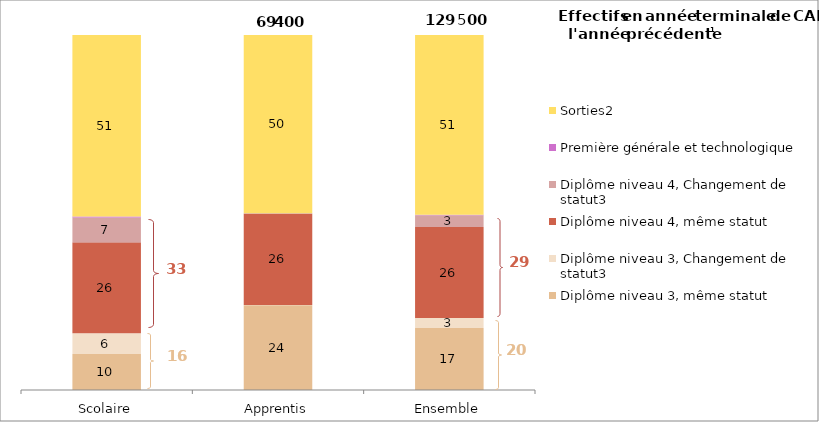
| Category | Diplôme niveau 3, même statut | Diplôme niveau 3, Changement de statut3 | Diplôme niveau 4, même statut | Diplôme niveau 4, Changement de statut3 | Première générale et technologique | Sorties2 |
|---|---|---|---|---|---|---|
| Scolaire | 10.153 | 5.853 | 25.539 | 7.08 | 0.259 | 51.116 |
| Apprentis | 23.837 | 0.097 | 25.705 | 0.143 | 0.016 | 50.191 |
| Ensemble | 17.484 | 2.769 | 25.628 | 3.364 | 0.129 | 50.62 |